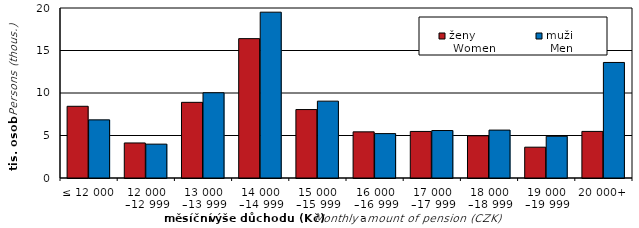
| Category | ženy 
 Women | muži 
 Men |
|---|---|---|
| ≤ 12 000 | 8437 | 6839 |
| 12 000
–12 999 | 4122 | 3984 |
| 13 000
–13 999 | 8901 | 10031 |
| 14 000
–14 999 | 16396 | 19509 |
| 15 000
–15 999 | 8052 | 9041 |
| 16 000
–16 999 | 5429 | 5223 |
| 17 000
–17 999 | 5477 | 5585 |
| 18 000
–18 999 | 4968 | 5636 |
| 19 000
–19 999 | 3626 | 4909 |
| 20 000+ | 5481 | 13593 |